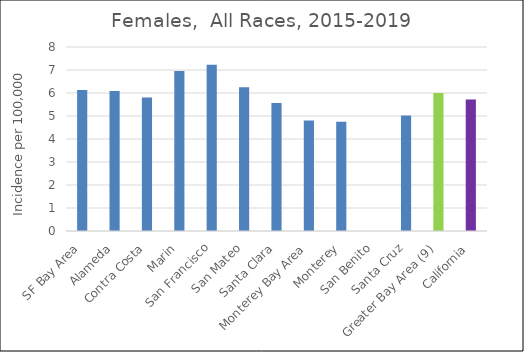
| Category | Female |
|---|---|
| SF Bay Area | 6.13 |
|   Alameda | 6.09 |
|   Contra Costa | 5.8 |
|   Marin | 6.96 |
|   San Francisco | 7.23 |
|   San Mateo | 6.25 |
|   Santa Clara | 5.57 |
| Monterey Bay Area | 4.8 |
|   Monterey | 4.75 |
|   San Benito | 0 |
|   Santa Cruz | 5.02 |
| Greater Bay Area (9) | 6 |
| California | 5.72 |